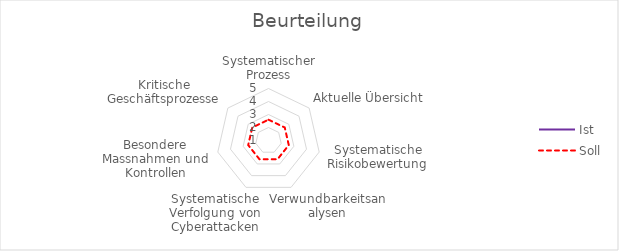
| Category | Ist | Soll |
|---|---|---|
| Systematischer Prozess | 1 | 2.6 |
| Aktuelle Übersicht | 1 | 2.6 |
| Systematische Risikobewertung | 1 | 2.6 |
| Verwundbarkeitsanalysen | 1 | 2.6 |
| Systematische Verfolgung von Cyberattacken | 1 | 2.6 |
| Besondere Massnahmen und Kontrollen | 1 | 2.6 |
| Kritische Geschäftsprozesse | 1 | 2.6 |